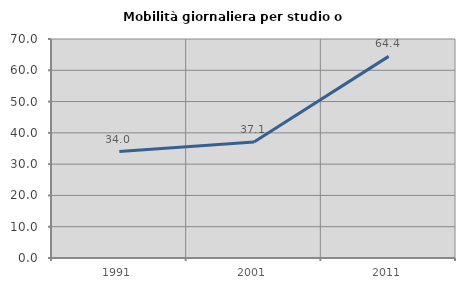
| Category | Mobilità giornaliera per studio o lavoro |
|---|---|
| 1991.0 | 34.021 |
| 2001.0 | 37.086 |
| 2011.0 | 64.444 |